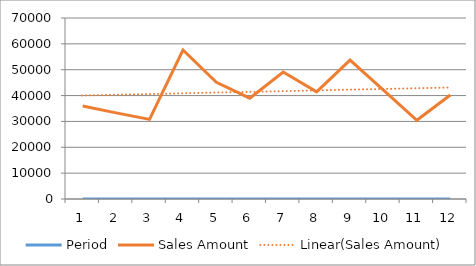
| Category | Period | Sales Amount |
|---|---|---|
| 0 | 1 | 35961 |
| 1 | 2 | 33319 |
| 2 | 3 | 30778 |
| 3 | 4 | 57617 |
| 4 | 5 | 45109 |
| 5 | 6 | 38992 |
| 6 | 7 | 49109 |
| 7 | 8 | 41459 |
| 8 | 9 | 53712 |
| 9 | 10 | 42136 |
| 10 | 11 | 30440 |
| 11 | 12 | 40229 |